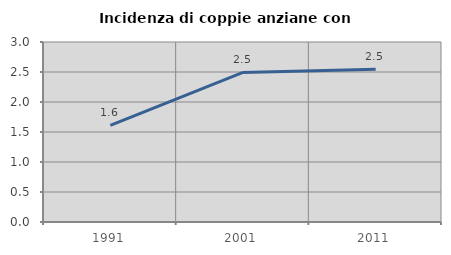
| Category | Incidenza di coppie anziane con figli |
|---|---|
| 1991.0 | 1.61 |
| 2001.0 | 2.493 |
| 2011.0 | 2.546 |